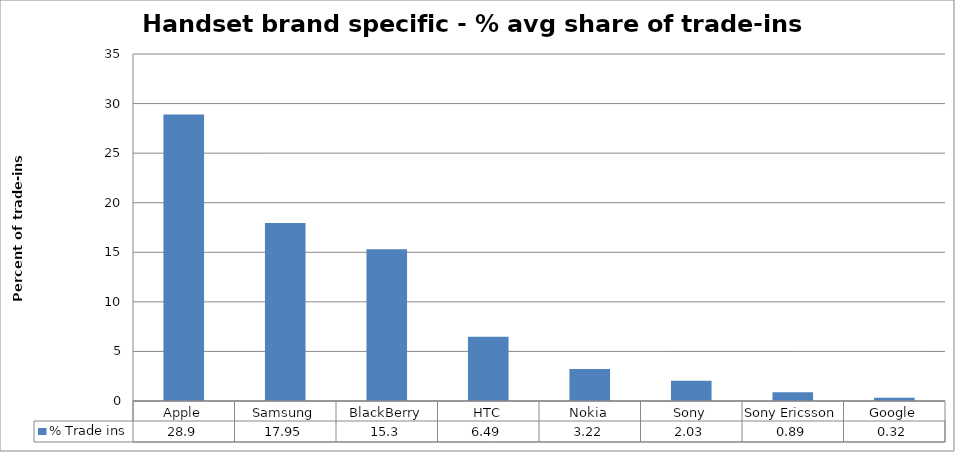
| Category | % Trade ins  |
|---|---|
| Apple | 28.9 |
| Samsung | 17.95 |
| BlackBerry | 15.3 |
| HTC | 6.49 |
| Nokia | 3.22 |
| Sony | 2.03 |
| Sony Ericsson | 0.89 |
| Google | 0.32 |